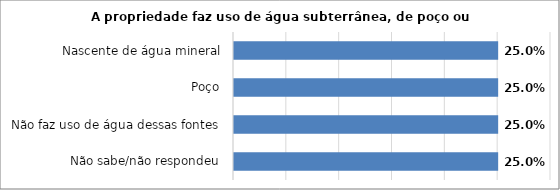
| Category | Series 0 |
|---|---|
| Não sabe/não respondeu | 0.25 |
| Não faz uso de água dessas fontes | 0.25 |
| Poço | 0.25 |
| Nascente de água mineral | 0.25 |